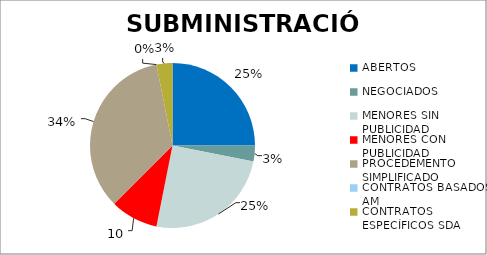
| Category | Series 0 |
|---|---|
| ABERTOS  | 0.25 |
| NEGOCIADOS  | 0.031 |
| MENORES SIN PUBLICIDAD | 0.25 |
| MENORES CON PUBLICIDAD | 0.094 |
| PROCEDEMENTO SIMPLIFICADO | 0.344 |
| CONTRATOS BASADOS AM | 0 |
| CONTRATOS ESPECÍFICOS SDA | 0.031 |